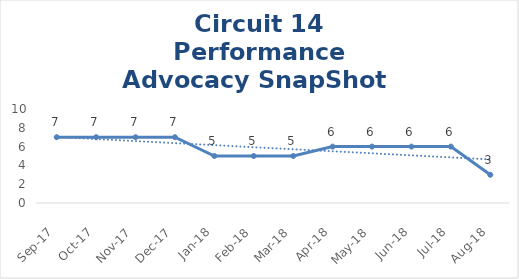
| Category | Circuit 14 |
|---|---|
| Sep-17 | 7 |
| Oct-17 | 7 |
| Nov-17 | 7 |
| Dec-17 | 7 |
| Jan-18 | 5 |
| Feb-18 | 5 |
| Mar-18 | 5 |
| Apr-18 | 6 |
| May-18 | 6 |
| Jun-18 | 6 |
| Jul-18 | 6 |
| Aug-18 | 3 |